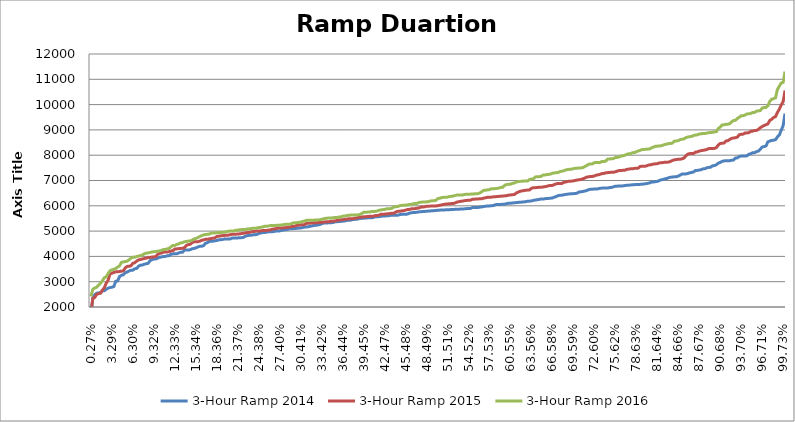
| Category | 3-Hour Ramp 2014 | 3-Hour Ramp 2015 | 3-Hour Ramp 2016 |
|---|---|---|---|
| 0.0027397260273972603 | 1722.645 | 1801.804 | 2419.036 |
| 0.005479452054794521 | 2354.762 | 2347.036 | 2704.117 |
| 0.00821917808219178 | 2487.279 | 2376.826 | 2749.465 |
| 0.010958904109589041 | 2544.366 | 2499.143 | 2782.071 |
| 0.0136986301369863 | 2558.562 | 2528.733 | 2866.87 |
| 0.01643835616438356 | 2566.786 | 2543.969 | 2934.298 |
| 0.019178082191780823 | 2636.337 | 2663.705 | 3034.781 |
| 0.021917808219178082 | 2641.023 | 2754.874 | 3157.875 |
| 0.024657534246575342 | 2701.696 | 2943.173 | 3193.702 |
| 0.0273972602739726 | 2744.516 | 3058.303 | 3326.202 |
| 0.030136986301369864 | 2767.047 | 3311.281 | 3429.154 |
| 0.03287671232876712 | 2781.11 | 3333.902 | 3466.346 |
| 0.03561643835616438 | 2810.325 | 3369.074 | 3490.285 |
| 0.038356164383561646 | 3014.747 | 3388.184 | 3520.314 |
| 0.0410958904109589 | 3033.631 | 3389.484 | 3577.344 |
| 0.043835616438356165 | 3204.575 | 3405.174 | 3626.997 |
| 0.04657534246575343 | 3252.057 | 3415.479 | 3765.784 |
| 0.049315068493150684 | 3274.86 | 3427.217 | 3781.316 |
| 0.052054794520547946 | 3350.421 | 3545.696 | 3795.408 |
| 0.0547945205479452 | 3383.981 | 3605.712 | 3811.444 |
| 0.057534246575342465 | 3424.864 | 3606.265 | 3866.078 |
| 0.06027397260273973 | 3455.809 | 3632.133 | 3934.354 |
| 0.06301369863013699 | 3457.171 | 3730.108 | 3965.42 |
| 0.06575342465753424 | 3512.356 | 3748.059 | 3969.297 |
| 0.0684931506849315 | 3524.815 | 3820.264 | 3999.604 |
| 0.07123287671232877 | 3614.964 | 3862.109 | 4008.546 |
| 0.07397260273972603 | 3651.753 | 3880.074 | 4036.948 |
| 0.07671232876712329 | 3658.883 | 3899.383 | 4049.045 |
| 0.07945205479452055 | 3691.977 | 3916.666 | 4108.119 |
| 0.0821917808219178 | 3709.363 | 3932.016 | 4128.247 |
| 0.08493150684931507 | 3726.409 | 3952.656 | 4136.85 |
| 0.08767123287671233 | 3832.23 | 3954.12 | 4156.36 |
| 0.09041095890410959 | 3871.631 | 3978.325 | 4175.566 |
| 0.09315068493150686 | 3894.974 | 3980.551 | 4185.663 |
| 0.0958904109589041 | 3897.661 | 3995.056 | 4192.198 |
| 0.09863013698630137 | 3931.318 | 4082.618 | 4206.129 |
| 0.10136986301369863 | 3965.686 | 4118.105 | 4217.115 |
| 0.10410958904109589 | 3975.209 | 4129.34 | 4239.375 |
| 0.10684931506849316 | 3996.105 | 4170.23 | 4274.331 |
| 0.1095890410958904 | 4000.456 | 4172.155 | 4274.738 |
| 0.11232876712328767 | 4022.257 | 4172.787 | 4301.646 |
| 0.11506849315068493 | 4030.095 | 4184.834 | 4315.018 |
| 0.1178082191780822 | 4086.264 | 4216.168 | 4382.013 |
| 0.12054794520547946 | 4099.191 | 4223.802 | 4432.266 |
| 0.1232876712328767 | 4104.824 | 4295.441 | 4432.988 |
| 0.12602739726027398 | 4105.17 | 4296.879 | 4471.108 |
| 0.12876712328767123 | 4136.228 | 4307.552 | 4494.733 |
| 0.13150684931506848 | 4162.403 | 4313.399 | 4534.982 |
| 0.13424657534246576 | 4162.418 | 4321.918 | 4544.663 |
| 0.136986301369863 | 4248.594 | 4341.027 | 4577.715 |
| 0.13972602739726028 | 4250.188 | 4431.552 | 4590.301 |
| 0.14246575342465753 | 4252.941 | 4464.672 | 4603.809 |
| 0.14520547945205478 | 4261.292 | 4474.948 | 4607.28 |
| 0.14794520547945206 | 4300.182 | 4540.61 | 4641.604 |
| 0.1506849315068493 | 4312.663 | 4579.899 | 4686.008 |
| 0.15342465753424658 | 4337.176 | 4580.707 | 4708.862 |
| 0.15616438356164383 | 4370.388 | 4581.214 | 4741.368 |
| 0.1589041095890411 | 4397.289 | 4598.074 | 4785.91 |
| 0.16164383561643836 | 4399.457 | 4639.514 | 4817.526 |
| 0.1643835616438356 | 4423.182 | 4648.597 | 4852.116 |
| 0.16712328767123288 | 4512.929 | 4674.785 | 4863.696 |
| 0.16986301369863013 | 4541.944 | 4676.633 | 4872.56 |
| 0.1726027397260274 | 4588.603 | 4690.198 | 4881.771 |
| 0.17534246575342466 | 4598.296 | 4706.439 | 4920.883 |
| 0.1780821917808219 | 4601.168 | 4720.23 | 4926.758 |
| 0.18082191780821918 | 4618.009 | 4731.613 | 4929.428 |
| 0.18356164383561643 | 4625.778 | 4787.46 | 4932.68 |
| 0.1863013698630137 | 4654.604 | 4799.317 | 4946.418 |
| 0.18904109589041096 | 4657.535 | 4808.215 | 4947.095 |
| 0.1917808219178082 | 4669.376 | 4822.91 | 4950.682 |
| 0.19452054794520549 | 4684.302 | 4829.863 | 4955.44 |
| 0.19726027397260273 | 4685.516 | 4833.975 | 4973.154 |
| 0.2 | 4687.218 | 4838.054 | 4996.718 |
| 0.20273972602739726 | 4690.957 | 4858.294 | 4999.534 |
| 0.2054794520547945 | 4723.047 | 4874.676 | 5001.509 |
| 0.20821917808219179 | 4726.082 | 4876.751 | 5006.49 |
| 0.21095890410958903 | 4726.516 | 4877.868 | 5032.837 |
| 0.2136986301369863 | 4730.134 | 4885.786 | 5036.414 |
| 0.21643835616438356 | 4740.493 | 4890.892 | 5052.235 |
| 0.2191780821917808 | 4740.928 | 4902.348 | 5060.905 |
| 0.2219178082191781 | 4751.253 | 4916.93 | 5061.596 |
| 0.22465753424657534 | 4800.098 | 4922.289 | 5064.892 |
| 0.2273972602739726 | 4820.554 | 4945.144 | 5084.515 |
| 0.23013698630136986 | 4833.034 | 4948.214 | 5088.499 |
| 0.2328767123287671 | 4833.123 | 4969.235 | 5101.719 |
| 0.2356164383561644 | 4853.384 | 4982.325 | 5109.786 |
| 0.23835616438356164 | 4854.886 | 4987.975 | 5113.736 |
| 0.2410958904109589 | 4868.765 | 5004.544 | 5120.665 |
| 0.24383561643835616 | 4907.569 | 5004.678 | 5145.08 |
| 0.2465753424657534 | 4921.993 | 5006.721 | 5147.719 |
| 0.2493150684931507 | 4943.176 | 5020.984 | 5161.149 |
| 0.25205479452054796 | 4944.84 | 5021.49 | 5187.971 |
| 0.2547945205479452 | 4954.565 | 5027.786 | 5194.085 |
| 0.25753424657534246 | 4970.616 | 5034.727 | 5198.113 |
| 0.2602739726027397 | 4975.671 | 5045.785 | 5216.669 |
| 0.26301369863013696 | 4977.732 | 5076.183 | 5220.58 |
| 0.26575342465753427 | 4981.09 | 5082.243 | 5223.01 |
| 0.2684931506849315 | 5001.621 | 5094.685 | 5225.125 |
| 0.27123287671232876 | 5004.931 | 5121.555 | 5234.467 |
| 0.273972602739726 | 5008.441 | 5124.452 | 5235.923 |
| 0.27671232876712326 | 5032.338 | 5124.995 | 5243.279 |
| 0.27945205479452057 | 5039.367 | 5129.111 | 5253.604 |
| 0.2821917808219178 | 5058.746 | 5135.634 | 5268.004 |
| 0.28493150684931506 | 5066.231 | 5149.51 | 5268.683 |
| 0.2876712328767123 | 5086.002 | 5158.079 | 5269.513 |
| 0.29041095890410956 | 5094.053 | 5176.892 | 5288.082 |
| 0.29315068493150687 | 5097.575 | 5190.553 | 5323.139 |
| 0.2958904109589041 | 5101.111 | 5196.539 | 5328.4 |
| 0.29863013698630136 | 5112.632 | 5230.039 | 5331.171 |
| 0.3013698630136986 | 5118.777 | 5230.776 | 5346.761 |
| 0.3041095890410959 | 5119.332 | 5248.222 | 5350.3 |
| 0.30684931506849317 | 5143.749 | 5254.221 | 5383.633 |
| 0.3095890410958904 | 5156.812 | 5254.519 | 5394.964 |
| 0.31232876712328766 | 5159.817 | 5305.408 | 5424.393 |
| 0.3150684931506849 | 5173.154 | 5309.866 | 5427.376 |
| 0.3178082191780822 | 5191.721 | 5315.118 | 5427.5 |
| 0.32054794520547947 | 5205.953 | 5321.715 | 5427.832 |
| 0.3232876712328767 | 5221.179 | 5330.121 | 5433.501 |
| 0.32602739726027397 | 5232.51 | 5333.136 | 5437.378 |
| 0.3287671232876712 | 5241.781 | 5335.057 | 5442.135 |
| 0.3315068493150685 | 5260.438 | 5340.718 | 5449.537 |
| 0.33424657534246577 | 5288.837 | 5351.393 | 5466.556 |
| 0.336986301369863 | 5320.762 | 5355.881 | 5487.717 |
| 0.33972602739726027 | 5323.404 | 5365.817 | 5503.288 |
| 0.3424657534246575 | 5324.445 | 5368.216 | 5512.164 |
| 0.3452054794520548 | 5326.462 | 5372.573 | 5518.628 |
| 0.34794520547945207 | 5331.964 | 5391.177 | 5519.482 |
| 0.3506849315068493 | 5341.02 | 5393.773 | 5530.204 |
| 0.35342465753424657 | 5364.278 | 5396.844 | 5536.308 |
| 0.3561643835616438 | 5367.608 | 5427.902 | 5537.281 |
| 0.3589041095890411 | 5380.313 | 5435.451 | 5555.243 |
| 0.36164383561643837 | 5383.935 | 5448.186 | 5556.176 |
| 0.3643835616438356 | 5392.376 | 5449.846 | 5590.534 |
| 0.36712328767123287 | 5397.663 | 5464.22 | 5594.24 |
| 0.3698630136986301 | 5419.438 | 5470.121 | 5609.332 |
| 0.3726027397260274 | 5427.813 | 5486.461 | 5630.686 |
| 0.37534246575342467 | 5428.777 | 5488.761 | 5631.205 |
| 0.3780821917808219 | 5453.002 | 5490.439 | 5635.723 |
| 0.38082191780821917 | 5460.425 | 5498.169 | 5638.057 |
| 0.3835616438356164 | 5470.282 | 5515.693 | 5639.925 |
| 0.3863013698630137 | 5474.112 | 5532.073 | 5640.725 |
| 0.38904109589041097 | 5501.678 | 5547.896 | 5657.476 |
| 0.3917808219178082 | 5503.847 | 5557.3 | 5692.756 |
| 0.39452054794520547 | 5508.014 | 5563.705 | 5742.8 |
| 0.3972602739726027 | 5519.753 | 5569.973 | 5746.59 |
| 0.4 | 5522.7 | 5575.119 | 5750.525 |
| 0.40273972602739727 | 5525.485 | 5582.898 | 5753.76 |
| 0.4054794520547945 | 5529.446 | 5585.962 | 5770.435 |
| 0.40821917808219177 | 5533.466 | 5588.847 | 5771.63 |
| 0.410958904109589 | 5566.019 | 5610.397 | 5779.682 |
| 0.4136986301369863 | 5567.806 | 5616.846 | 5790.135 |
| 0.41643835616438357 | 5570.641 | 5625.036 | 5821.068 |
| 0.4191780821917808 | 5584.967 | 5667.706 | 5835.226 |
| 0.42191780821917807 | 5592.281 | 5667.905 | 5848.625 |
| 0.4246575342465753 | 5594.781 | 5670.455 | 5850.524 |
| 0.4273972602739726 | 5603.761 | 5679.362 | 5882.087 |
| 0.4301369863013699 | 5605.383 | 5684.406 | 5882.431 |
| 0.4328767123287671 | 5621.609 | 5698.736 | 5886.358 |
| 0.43561643835616437 | 5626.219 | 5702.715 | 5906.897 |
| 0.4383561643835616 | 5626.291 | 5711.897 | 5958.06 |
| 0.4410958904109589 | 5626.686 | 5760.182 | 5963.985 |
| 0.4438356164383562 | 5630.007 | 5781.118 | 5974.377 |
| 0.4465753424657534 | 5652.701 | 5782.59 | 6006.474 |
| 0.44931506849315067 | 5663.158 | 5800.28 | 6014.164 |
| 0.4520547945205479 | 5664.54 | 5806.897 | 6025.639 |
| 0.4547945205479452 | 5666.884 | 5828.76 | 6025.918 |
| 0.4575342465753425 | 5672.509 | 5851.993 | 6033.634 |
| 0.4602739726027397 | 5709.098 | 5855.981 | 6052.361 |
| 0.46301369863013697 | 5723.814 | 5878.986 | 6058.936 |
| 0.4657534246575342 | 5736.296 | 5887.928 | 6081.113 |
| 0.4684931506849315 | 5738.043 | 5888.338 | 6090.539 |
| 0.4712328767123288 | 5745.876 | 5903.375 | 6095.11 |
| 0.473972602739726 | 5760.064 | 5916.237 | 6131.242 |
| 0.4767123287671233 | 5764.68 | 5945.849 | 6143.358 |
| 0.4794520547945205 | 5776.33 | 5954.772 | 6147.2 |
| 0.4821917808219178 | 5777.044 | 5958.23 | 6149.172 |
| 0.4849315068493151 | 5786.501 | 5983.848 | 6159.04 |
| 0.4876712328767123 | 5791.234 | 5984.415 | 6162.668 |
| 0.4904109589041096 | 5797.363 | 5988.275 | 6193.165 |
| 0.4931506849315068 | 5803.528 | 5988.879 | 6195.982 |
| 0.4958904109589041 | 5808.986 | 5989.539 | 6197.543 |
| 0.4986301369863014 | 5817.498 | 5996.072 | 6219.933 |
| 0.5013698630136987 | 5821.896 | 6005.025 | 6291.966 |
| 0.5041095890410959 | 5830.139 | 6020.605 | 6297.408 |
| 0.5068493150684932 | 5832.534 | 6037.981 | 6324.271 |
| 0.5095890410958904 | 5833.38 | 6051.374 | 6333.839 |
| 0.5123287671232877 | 5840.551 | 6068.235 | 6336.221 |
| 0.5150684931506849 | 5840.88 | 6073.343 | 6343.646 |
| 0.5178082191780822 | 5845.887 | 6080.718 | 6367.026 |
| 0.5205479452054794 | 5853.712 | 6086.927 | 6373.055 |
| 0.5232876712328767 | 5856.307 | 6091.227 | 6386.44 |
| 0.5260273972602739 | 5859.95 | 6114.724 | 6407.668 |
| 0.5287671232876713 | 5864.069 | 6147.089 | 6425.19 |
| 0.5315068493150685 | 5866.255 | 6163.856 | 6425.55 |
| 0.5342465753424658 | 5873.001 | 6180.82 | 6427.983 |
| 0.536986301369863 | 5874.126 | 6185.883 | 6431.105 |
| 0.5397260273972603 | 5879.472 | 6203.889 | 6449.426 |
| 0.5424657534246575 | 5888.703 | 6213.049 | 6453.56 |
| 0.5452054794520548 | 5894.728 | 6217.504 | 6454.59 |
| 0.547945205479452 | 5895.224 | 6222.411 | 6460.118 |
| 0.5506849315068493 | 5928.268 | 6255.246 | 6466.685 |
| 0.5534246575342465 | 5931.242 | 6260.666 | 6471.379 |
| 0.5561643835616439 | 5931.245 | 6269.378 | 6475.77 |
| 0.5589041095890411 | 5934.987 | 6272.85 | 6481.423 |
| 0.5616438356164384 | 5947.884 | 6275.115 | 6510.442 |
| 0.5643835616438356 | 5955.448 | 6278.67 | 6560.776 |
| 0.5671232876712329 | 5973.042 | 6305.692 | 6612.332 |
| 0.5698630136986301 | 5984.716 | 6315.757 | 6613.345 |
| 0.5726027397260274 | 5989.763 | 6337.521 | 6630.894 |
| 0.5753424657534246 | 5995.163 | 6340.363 | 6638.211 |
| 0.5780821917808219 | 6005.407 | 6340.376 | 6672.656 |
| 0.5808219178082191 | 6007.615 | 6354.028 | 6674.476 |
| 0.5835616438356165 | 6042.466 | 6354.847 | 6679.679 |
| 0.5863013698630137 | 6049.964 | 6368.304 | 6688.843 |
| 0.589041095890411 | 6054.187 | 6372.6 | 6702.473 |
| 0.5917808219178082 | 6056.093 | 6378.931 | 6727.473 |
| 0.5945205479452055 | 6059.404 | 6386.006 | 6730.447 |
| 0.5972602739726027 | 6064.343 | 6393.185 | 6813.473 |
| 0.6 | 6086.075 | 6400.344 | 6837.324 |
| 0.6027397260273972 | 6101.797 | 6422.067 | 6854.212 |
| 0.6054794520547945 | 6102.129 | 6424.811 | 6855.657 |
| 0.6082191780821918 | 6108.456 | 6438.559 | 6887.678 |
| 0.6109589041095891 | 6122.228 | 6445.596 | 6898.139 |
| 0.6136986301369863 | 6125.402 | 6502.248 | 6940.643 |
| 0.6164383561643836 | 6134.499 | 6537.595 | 6953.554 |
| 0.6191780821917808 | 6140.326 | 6572.896 | 6962.445 |
| 0.6219178082191781 | 6146.839 | 6589.099 | 6973.229 |
| 0.6246575342465753 | 6152.859 | 6600.602 | 6977.743 |
| 0.6273972602739726 | 6163.406 | 6617.255 | 6981.273 |
| 0.6301369863013698 | 6181.397 | 6619.883 | 6982.038 |
| 0.6328767123287671 | 6184.986 | 6626.506 | 7038.417 |
| 0.6356164383561644 | 6189.275 | 6692.265 | 7053.126 |
| 0.6383561643835617 | 6214.792 | 6716.465 | 7067.626 |
| 0.6410958904109589 | 6227.423 | 6716.874 | 7139.842 |
| 0.6438356164383562 | 6239.133 | 6721.803 | 7149 |
| 0.6465753424657534 | 6250.928 | 6733.759 | 7152.066 |
| 0.6493150684931507 | 6267.656 | 6733.98 | 7158.938 |
| 0.6520547945205479 | 6273.243 | 6741.279 | 7211.723 |
| 0.6547945205479452 | 6273.908 | 6755.827 | 7217.834 |
| 0.6575342465753424 | 6291.143 | 6769.193 | 7235.578 |
| 0.6602739726027397 | 6292.791 | 6792.511 | 7241.578 |
| 0.663013698630137 | 6299.627 | 6804.182 | 7254.687 |
| 0.6657534246575343 | 6309.369 | 6805.567 | 7284.822 |
| 0.6684931506849315 | 6341.467 | 6841.322 | 7300.108 |
| 0.6712328767123288 | 6362.69 | 6866.508 | 7310.814 |
| 0.673972602739726 | 6403.515 | 6882.976 | 7314.658 |
| 0.6767123287671233 | 6414.685 | 6884.217 | 7351.809 |
| 0.6794520547945205 | 6418.829 | 6884.936 | 7368.589 |
| 0.6821917808219178 | 6436.604 | 6930.765 | 7384.883 |
| 0.684931506849315 | 6450.223 | 6937.251 | 7415.594 |
| 0.6876712328767123 | 6460.785 | 6963.008 | 7435.025 |
| 0.6904109589041096 | 6469.193 | 6972.842 | 7440.259 |
| 0.6931506849315069 | 6477.633 | 6975.389 | 7446.288 |
| 0.6958904109589041 | 6480.867 | 6984.915 | 7469.554 |
| 0.6986301369863014 | 6487.02 | 7003.28 | 7480.793 |
| 0.7013698630136986 | 6500.825 | 7020.497 | 7485.789 |
| 0.7041095890410959 | 6548.845 | 7028.576 | 7497.821 |
| 0.7068493150684931 | 6552.701 | 7039.236 | 7498.134 |
| 0.7095890410958904 | 6567.374 | 7068.19 | 7507.18 |
| 0.7123287671232876 | 6584.615 | 7096.229 | 7553.908 |
| 0.7150684931506849 | 6601.792 | 7134.479 | 7591.449 |
| 0.7178082191780822 | 6637.669 | 7146.087 | 7643.35 |
| 0.7205479452054795 | 6655.452 | 7158.169 | 7654.619 |
| 0.7232876712328767 | 6656.314 | 7161.574 | 7657.06 |
| 0.726027397260274 | 6662.188 | 7179.146 | 7705.864 |
| 0.7287671232876712 | 6662.222 | 7212.436 | 7708.273 |
| 0.7315068493150685 | 6674.504 | 7223.299 | 7708.633 |
| 0.7342465753424657 | 6689.461 | 7245.597 | 7713.817 |
| 0.736986301369863 | 6698.476 | 7274.086 | 7754.093 |
| 0.7397260273972602 | 6699.368 | 7280.681 | 7755.822 |
| 0.7424657534246575 | 6701.86 | 7305.314 | 7765.747 |
| 0.7452054794520548 | 6702.925 | 7311.353 | 7850.823 |
| 0.7479452054794521 | 6719.001 | 7319.754 | 7853.241 |
| 0.7506849315068493 | 6723.752 | 7323.424 | 7858.792 |
| 0.7534246575342466 | 6750.55 | 7327.122 | 7867.146 |
| 0.7561643835616438 | 6770.692 | 7344.222 | 7906.965 |
| 0.7589041095890411 | 6776.906 | 7372.443 | 7915.63 |
| 0.7616438356164383 | 6780.197 | 7392.24 | 7931.063 |
| 0.7643835616438356 | 6781.49 | 7394.008 | 7966.735 |
| 0.7671232876712328 | 6787.227 | 7405.256 | 7976.222 |
| 0.7698630136986301 | 6801.663 | 7408.394 | 7999.752 |
| 0.7726027397260274 | 6810.031 | 7438.189 | 8036.493 |
| 0.7753424657534247 | 6814.04 | 7450.541 | 8053.794 |
| 0.7780821917808219 | 6823.879 | 7461.662 | 8056.636 |
| 0.7808219178082192 | 6830.216 | 7465.878 | 8099.114 |
| 0.7835616438356164 | 6835.649 | 7478.368 | 8105.814 |
| 0.7863013698630137 | 6840.775 | 7484.512 | 8133.789 |
| 0.7890410958904109 | 6844.327 | 7488.867 | 8168.449 |
| 0.7917808219178082 | 6846.901 | 7553.679 | 8189.452 |
| 0.7945205479452054 | 6852.105 | 7564.826 | 8224.415 |
| 0.7972602739726027 | 6864.252 | 7565.603 | 8226.6 |
| 0.8 | 6870.969 | 7568.511 | 8236.305 |
| 0.8027397260273973 | 6887.752 | 7598.599 | 8240.937 |
| 0.8054794520547945 | 6905.625 | 7618.598 | 8247.523 |
| 0.8082191780821918 | 6936.883 | 7627.256 | 8293.077 |
| 0.810958904109589 | 6938.11 | 7652.76 | 8316.847 |
| 0.8136986301369863 | 6955.344 | 7657.097 | 8355.045 |
| 0.8164383561643835 | 6963.212 | 7662.415 | 8357.841 |
| 0.8191780821917808 | 6997.198 | 7694.907 | 8362.391 |
| 0.821917808219178 | 7027.346 | 7699.449 | 8371.717 |
| 0.8246575342465754 | 7037.392 | 7710.646 | 8397.998 |
| 0.8273972602739726 | 7067.433 | 7719.715 | 8424.767 |
| 0.8301369863013699 | 7079.469 | 7721.755 | 8438.307 |
| 0.8328767123287671 | 7112.521 | 7729.259 | 8460.474 |
| 0.8356164383561644 | 7130.147 | 7755.786 | 8463.544 |
| 0.8383561643835616 | 7136.516 | 7792.06 | 8481.219 |
| 0.8410958904109589 | 7146.6 | 7820.192 | 8554.665 |
| 0.8438356164383561 | 7148.23 | 7827.414 | 8563.388 |
| 0.8465753424657534 | 7173.261 | 7839.963 | 8576.224 |
| 0.8493150684931506 | 7213.687 | 7840.76 | 8614.457 |
| 0.852054794520548 | 7256.378 | 7858.397 | 8633.16 |
| 0.8547945205479452 | 7258.837 | 7887.772 | 8641.989 |
| 0.8575342465753425 | 7259.756 | 7978.73 | 8696.656 |
| 0.8602739726027397 | 7276.963 | 8039.737 | 8717.832 |
| 0.863013698630137 | 7304.477 | 8063.017 | 8732.653 |
| 0.8657534246575342 | 7318.262 | 8066.138 | 8741.277 |
| 0.8684931506849315 | 7336.002 | 8067.11 | 8776.531 |
| 0.8712328767123287 | 7394.727 | 8120.845 | 8798.431 |
| 0.873972602739726 | 7399.741 | 8130.093 | 8804.258 |
| 0.8767123287671232 | 7412.533 | 8164.4 | 8836.755 |
| 0.8794520547945206 | 7428.967 | 8178.389 | 8846.863 |
| 0.8821917808219178 | 7459.175 | 8195.664 | 8857.468 |
| 0.8849315068493151 | 7467.875 | 8204.437 | 8858.131 |
| 0.8876712328767123 | 7504.494 | 8227.066 | 8874.967 |
| 0.8904109589041096 | 7516.522 | 8260.021 | 8888.878 |
| 0.8931506849315068 | 7527.235 | 8262.46 | 8898.674 |
| 0.8958904109589041 | 7582.461 | 8262.675 | 8903.221 |
| 0.8986301369863013 | 7588.758 | 8269.548 | 8918.054 |
| 0.9013698630136986 | 7624.054 | 8304.781 | 8934.785 |
| 0.9041095890410958 | 7686.667 | 8402.578 | 9053.877 |
| 0.9068493150684932 | 7710.656 | 8463.807 | 9113.087 |
| 0.9095890410958904 | 7756.281 | 8471.362 | 9196.834 |
| 0.9123287671232877 | 7775.037 | 8481.003 | 9199.607 |
| 0.915068493150685 | 7778.225 | 8562.487 | 9220.689 |
| 0.9178082191780822 | 7780.171 | 8570.722 | 9224.723 |
| 0.9205479452054794 | 7782.462 | 8622.851 | 9245.951 |
| 0.9232876712328767 | 7801.499 | 8664.933 | 9321.891 |
| 0.9260273972602739 | 7809.952 | 8679.52 | 9369.022 |
| 0.9287671232876712 | 7888.243 | 8690.868 | 9379.835 |
| 0.9315068493150684 | 7893.68 | 8714.596 | 9450.877 |
| 0.9342465753424658 | 7953.182 | 8808.431 | 9500.494 |
| 0.936986301369863 | 7963.723 | 8827.828 | 9557.872 |
| 0.9397260273972603 | 7965.602 | 8832.4 | 9560.785 |
| 0.9424657534246575 | 7967.406 | 8876.174 | 9586.329 |
| 0.9452054794520548 | 7974.649 | 8880.605 | 9632.205 |
| 0.947945205479452 | 8037.118 | 8889.562 | 9634.017 |
| 0.9506849315068493 | 8056.459 | 8940.162 | 9650.531 |
| 0.9534246575342465 | 8095.951 | 8952.314 | 9687.674 |
| 0.9561643835616438 | 8100.949 | 8975.254 | 9688.448 |
| 0.958904109589041 | 8140.24 | 8978.723 | 9741.254 |
| 0.9616438356164384 | 8161.456 | 9019.54 | 9752.203 |
| 0.9643835616438357 | 8235.089 | 9087.539 | 9763.27 |
| 0.9671232876712329 | 8323.566 | 9132.383 | 9861.339 |
| 0.9698630136986301 | 8340.908 | 9174.152 | 9885.393 |
| 0.9726027397260274 | 8364.825 | 9204.301 | 9889.161 |
| 0.9753424657534246 | 8527.14 | 9237.246 | 9950.949 |
| 0.9780821917808219 | 8559.358 | 9374.793 | 10129.341 |
| 0.9808219178082191 | 8583.573 | 9421.919 | 10213.671 |
| 0.9835616438356164 | 8594.269 | 9490.925 | 10234.864 |
| 0.9863013698630136 | 8612.658 | 9526.608 | 10269.132 |
| 0.989041095890411 | 8722.433 | 9688.01 | 10597.019 |
| 0.9917808219178083 | 8798.521 | 9816.841 | 10725.909 |
| 0.9945205479452055 | 8988.907 | 9986.312 | 10854.103 |
| 0.9972602739726028 | 9167.046 | 10113.032 | 10877.412 |
| 1.0 | 9648.038 | 10558.632 | 11305.682 |